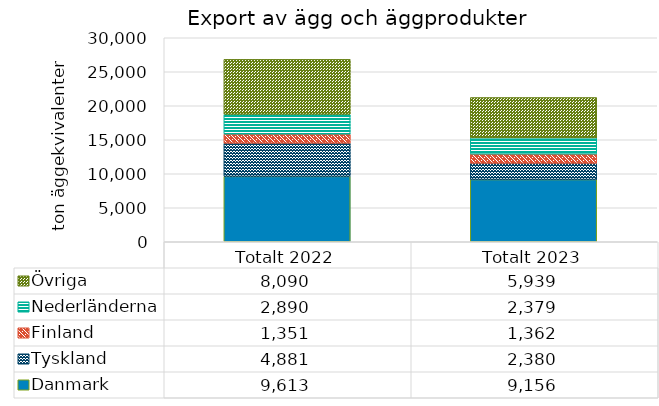
| Category | Danmark | Tyskland | Finland | Nederländerna | Övriga |
|---|---|---|---|---|---|
| Totalt 2022 | 9612.7 | 4881.44 | 1350.54 | 2889.64 | 8090.26 |
| Totalt 2023 | 9155.74 | 2379.56 | 1361.8 | 2379.08 | 5938.94 |